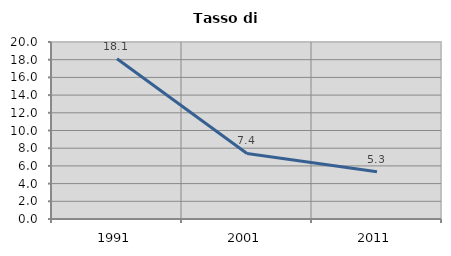
| Category | Tasso di disoccupazione   |
|---|---|
| 1991.0 | 18.111 |
| 2001.0 | 7.407 |
| 2011.0 | 5.339 |